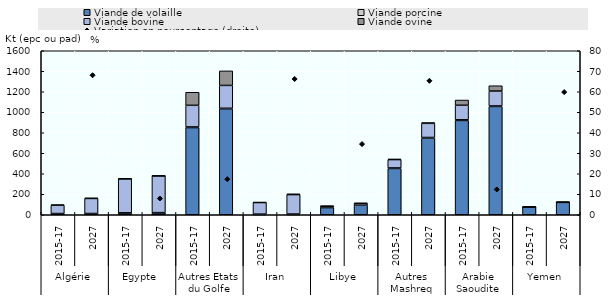
| Category | Viande de volaille | Viande porcine | Viande bovine | Viande ovine |
|---|---|---|---|---|
| 0 | 11.684 | 0.072 | 81.696 | 3.849 |
| 1 | 12.131 | 0.072 | 146.922 | 4.513 |
| 2 | 18.109 | 0.907 | 332 | 0.558 |
| 3 | 19.516 | 1.434 | 358.653 | 0.275 |
| 4 | 850.41 | 6.308 | 211.01 | 127.415 |
| 5 | 1033.698 | 5.3 | 222.798 | 141.997 |
| 6 | 2.075 | 3.88 | 113.27 | 3.124 |
| 7 | 1.989 | 4.95 | 189.804 | 6.786 |
| 8 | 71.109 | 0.007 | 12.667 | 1 |
| 9 | 93.184 | 0.007 | 17.566 | 3.364 |
| 10 | 451.604 | 5.212 | 81.41 | 5.338 |
| 11 | 748.235 | 5.6 | 138.033 | 7.482 |
| 12 | 920.209 | 6.455 | 141.689 | 50.959 |
| 13 | 1056.683 | 5 | 145.288 | 51.774 |
| 14 | 74.245 | 0.034 | 0.328 | 1.902 |
| 15 | 121.446 | 0.034 | 0.095 | 0.803 |